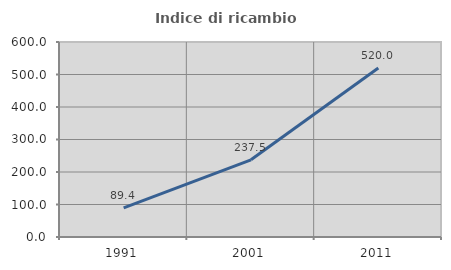
| Category | Indice di ricambio occupazionale  |
|---|---|
| 1991.0 | 89.412 |
| 2001.0 | 237.5 |
| 2011.0 | 520 |